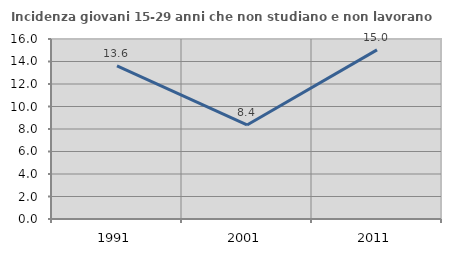
| Category | Incidenza giovani 15-29 anni che non studiano e non lavorano  |
|---|---|
| 1991.0 | 13.609 |
| 2001.0 | 8.359 |
| 2011.0 | 15.038 |